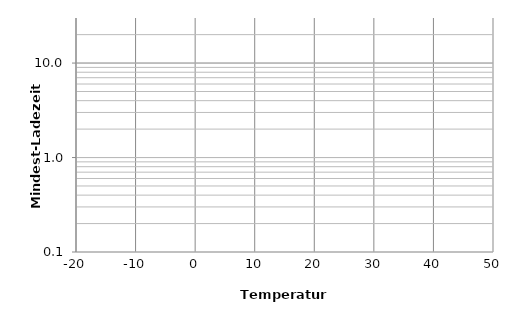
| Category | Series 0 |
|---|---|
| -20.0 | 20 |
| -10.0 | 9 |
| 0.0 | 4.4 |
| 15.0 | 1.6 |
| 25.0 | 1 |
| 45.0 | 0.5 |